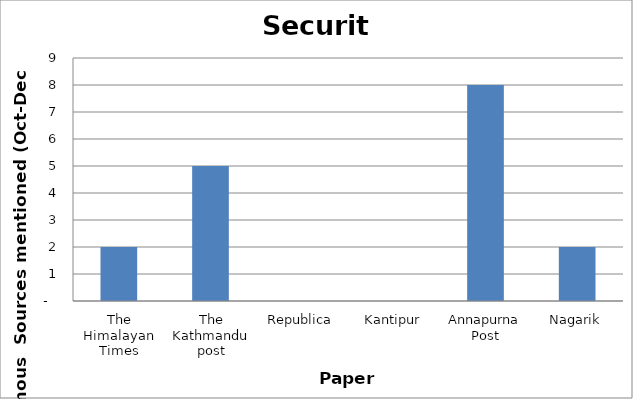
| Category | Security |
|---|---|
| The Himalayan Times | 2 |
| The Kathmandu post | 5 |
| Republica | 0 |
| Kantipur | 0 |
| Annapurna Post | 8 |
| Nagarik | 2 |